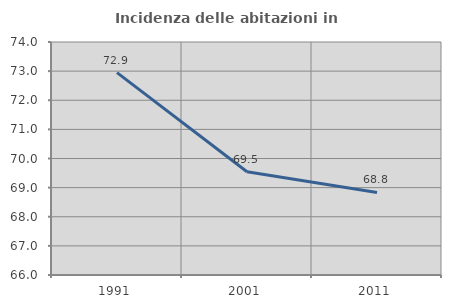
| Category | Incidenza delle abitazioni in proprietà  |
|---|---|
| 1991.0 | 72.949 |
| 2001.0 | 69.543 |
| 2011.0 | 68.836 |